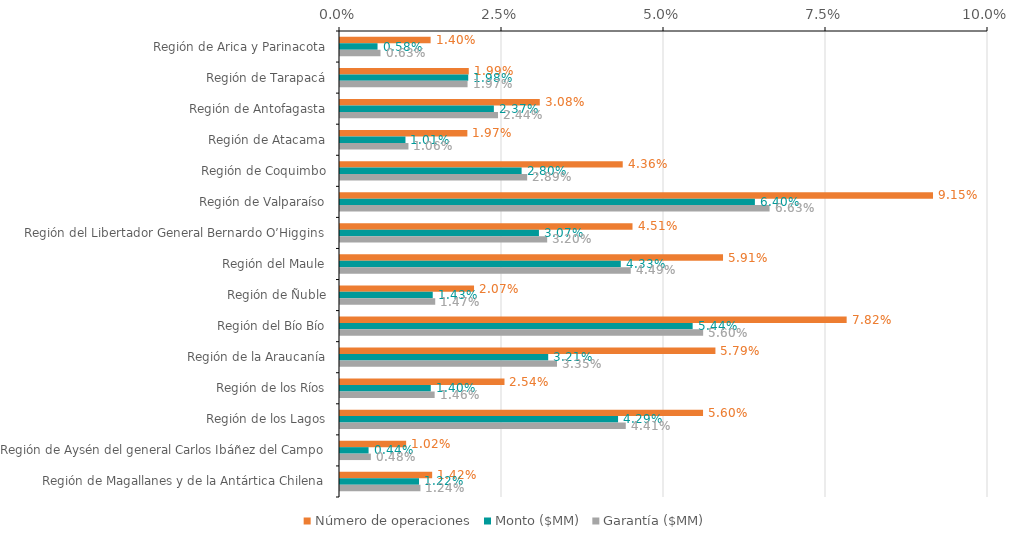
| Category | Número de operaciones | Monto ($MM) | Garantía ($MM) |
|---|---|---|---|
| Región de Arica y Parinacota | 0.014 | 0.006 | 0.006 |
| Región de Tarapacá | 0.02 | 0.02 | 0.02 |
| Región de Antofagasta | 0.031 | 0.024 | 0.024 |
| Región de Atacama | 0.02 | 0.01 | 0.011 |
| Región de Coquimbo | 0.044 | 0.028 | 0.029 |
| Región de Valparaíso | 0.092 | 0.064 | 0.066 |
| Región del Libertador General Bernardo O’Higgins | 0.045 | 0.031 | 0.032 |
| Región del Maule | 0.059 | 0.043 | 0.045 |
| Región de Ñuble | 0.021 | 0.014 | 0.015 |
| Región del Bío Bío | 0.078 | 0.054 | 0.056 |
| Región de la Araucanía | 0.058 | 0.032 | 0.033 |
| Región de los Ríos | 0.025 | 0.014 | 0.015 |
| Región de los Lagos | 0.056 | 0.043 | 0.044 |
| Región de Aysén del general Carlos Ibáñez del Campo | 0.01 | 0.004 | 0.005 |
| Región de Magallanes y de la Antártica Chilena | 0.014 | 0.012 | 0.012 |